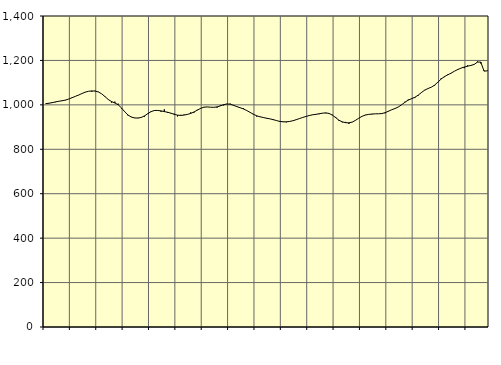
| Category | Piggar | Series 1 |
|---|---|---|
| nan | 1004.8 | 1005.51 |
| 87.0 | 1006.3 | 1007.26 |
| 87.0 | 1012.5 | 1010.03 |
| 87.0 | 1011.9 | 1013.34 |
| nan | 1016.5 | 1016.12 |
| 88.0 | 1019.9 | 1018.58 |
| 88.0 | 1020.4 | 1021.54 |
| 88.0 | 1026.1 | 1026.12 |
| nan | 1033.2 | 1032.2 |
| 89.0 | 1037.8 | 1038.21 |
| 89.0 | 1043.7 | 1044.15 |
| 89.0 | 1050.5 | 1050.85 |
| nan | 1058 | 1057.15 |
| 90.0 | 1061.3 | 1061.14 |
| 90.0 | 1059.1 | 1062.72 |
| 90.0 | 1063.6 | 1062.07 |
| nan | 1058.9 | 1058.08 |
| 91.0 | 1049.6 | 1049.64 |
| 91.0 | 1038.5 | 1037.22 |
| 91.0 | 1024.8 | 1024.09 |
| nan | 1010.1 | 1014.65 |
| 92.0 | 1014.7 | 1008.5 |
| 92.0 | 1005.3 | 1000.41 |
| 92.0 | 983.9 | 986.2 |
| nan | 969.5 | 968.64 |
| 93.0 | 951.6 | 954.05 |
| 93.0 | 946.1 | 944.99 |
| 93.0 | 941.9 | 941 |
| nan | 941.4 | 940.5 |
| 94.0 | 942.5 | 943.37 |
| 94.0 | 946.7 | 950.44 |
| 94.0 | 961.9 | 960.38 |
| nan | 967.7 | 969.74 |
| 95.0 | 976.5 | 974.57 |
| 95.0 | 975.6 | 974.82 |
| 95.0 | 968.8 | 972.82 |
| nan | 979.9 | 969.72 |
| 96.0 | 963.7 | 966.71 |
| 96.0 | 961.3 | 962.6 |
| 96.0 | 960.4 | 957.45 |
| nan | 947.8 | 953.65 |
| 97.0 | 955 | 952.32 |
| 97.0 | 956.2 | 954.07 |
| 97.0 | 955.9 | 957.08 |
| nan | 966.2 | 961.3 |
| 98.0 | 964.8 | 967.96 |
| 98.0 | 977.8 | 976.19 |
| 98.0 | 985.8 | 984.06 |
| nan | 990.5 | 989.47 |
| 99.0 | 990.5 | 990.64 |
| 99.0 | 989.4 | 989.43 |
| 99.0 | 988.8 | 988.86 |
| nan | 987.2 | 990.88 |
| 0.0 | 997.7 | 995.38 |
| 0.0 | 997.4 | 1000.78 |
| 0.0 | 1002.8 | 1004.08 |
| nan | 1005.5 | 1002.96 |
| 1.0 | 996.5 | 997.92 |
| 1.0 | 993.4 | 991.99 |
| 1.0 | 987.9 | 987.09 |
| nan | 984.8 | 981.61 |
| 2.0 | 973.7 | 974.58 |
| 2.0 | 966.1 | 966.24 |
| 2.0 | 959.3 | 957.79 |
| nan | 947.3 | 950.95 |
| 3.0 | 947.2 | 946.34 |
| 3.0 | 943.5 | 943.02 |
| 3.0 | 938.5 | 939.9 |
| nan | 936.5 | 937.07 |
| 4.0 | 931.6 | 933.67 |
| 4.0 | 929.2 | 929.4 |
| 4.0 | 923.6 | 925.66 |
| nan | 925.2 | 923.67 |
| 5.0 | 921.1 | 923.8 |
| 5.0 | 926.3 | 925.28 |
| 5.0 | 928.8 | 928.47 |
| nan | 932.4 | 933.1 |
| 6.0 | 937.7 | 938.26 |
| 6.0 | 944 | 943.36 |
| 6.0 | 948.2 | 947.87 |
| nan | 950.9 | 952.06 |
| 7.0 | 955.9 | 955.2 |
| 7.0 | 955.7 | 957.35 |
| 7.0 | 958.1 | 959.97 |
| nan | 963.4 | 962.69 |
| 8.0 | 961.8 | 963.87 |
| 8.0 | 959.5 | 961.27 |
| 8.0 | 955.2 | 953.58 |
| nan | 945.8 | 942.27 |
| 9.0 | 927.4 | 930.68 |
| 9.0 | 921.3 | 923.42 |
| 9.0 | 923.2 | 919.83 |
| nan | 914.3 | 919.07 |
| 10.0 | 921.8 | 922.42 |
| 10.0 | 929.9 | 930.3 |
| 10.0 | 940.1 | 940.01 |
| nan | 948.7 | 948.38 |
| 11.0 | 955.2 | 954.02 |
| 11.0 | 956.2 | 957.02 |
| 11.0 | 957.4 | 958.66 |
| nan | 959.6 | 959.64 |
| 12.0 | 959.7 | 959.79 |
| 12.0 | 959.4 | 960.88 |
| 12.0 | 962.2 | 964.83 |
| nan | 972.5 | 971.41 |
| 13.0 | 978.3 | 978.1 |
| 13.0 | 984.6 | 983.55 |
| 13.0 | 990.3 | 990.5 |
| nan | 1000.4 | 1000.42 |
| 14.0 | 1014.1 | 1011.8 |
| 14.0 | 1023.8 | 1021.3 |
| 14.0 | 1029.2 | 1027.7 |
| nan | 1030.4 | 1034.1 |
| 15.0 | 1040.8 | 1043.43 |
| 15.0 | 1054.2 | 1055.46 |
| 15.0 | 1067.3 | 1066.16 |
| nan | 1073.6 | 1073.63 |
| 16.0 | 1079.3 | 1079.59 |
| 16.0 | 1086.3 | 1088.87 |
| 16.0 | 1103 | 1102.32 |
| nan | 1119.8 | 1116.34 |
| 17.0 | 1124.8 | 1127.41 |
| 17.0 | 1137.4 | 1135.28 |
| 17.0 | 1141.9 | 1142.73 |
| nan | 1151.1 | 1151.3 |
| 18.0 | 1161 | 1158.95 |
| 18.0 | 1165.3 | 1165.28 |
| 18.0 | 1165.2 | 1170.35 |
| nan | 1178 | 1174.03 |
| 19.0 | 1179.1 | 1177.48 |
| 19.0 | 1181.1 | 1181.89 |
| 19.0 | 1195.3 | 1192.42 |
| nan | 1186.5 | 1192.78 |
| 20.0 | 1154.7 | 1151.98 |
| 20.0 | 1154.9 | 1152.91 |